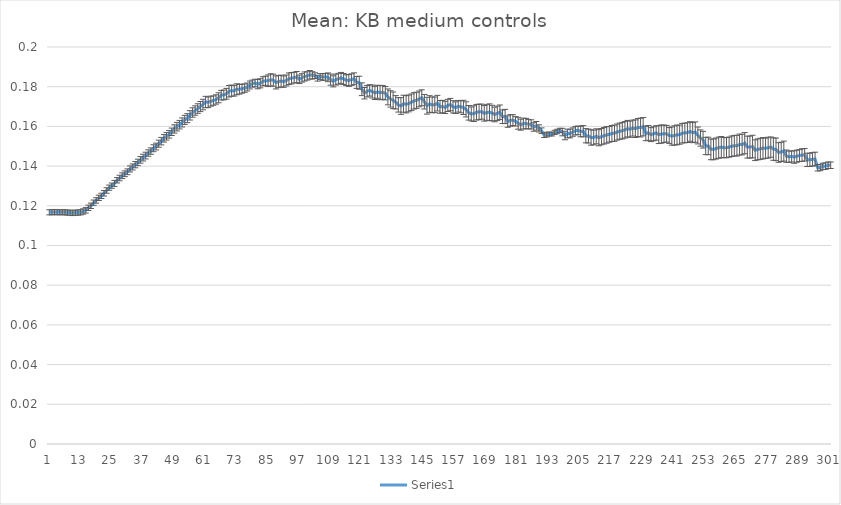
| Category | Series 0 |
|---|---|
| 0 | 0.117 |
| 1 | 0.117 |
| 2 | 0.117 |
| 3 | 0.117 |
| 4 | 0.117 |
| 5 | 0.117 |
| 6 | 0.117 |
| 7 | 0.117 |
| 8 | 0.117 |
| 9 | 0.116 |
| 10 | 0.117 |
| 11 | 0.117 |
| 12 | 0.117 |
| 13 | 0.117 |
| 14 | 0.118 |
| 15 | 0.119 |
| 16 | 0.12 |
| 17 | 0.122 |
| 18 | 0.123 |
| 19 | 0.124 |
| 20 | 0.125 |
| 21 | 0.126 |
| 22 | 0.128 |
| 23 | 0.129 |
| 24 | 0.13 |
| 25 | 0.131 |
| 26 | 0.133 |
| 27 | 0.134 |
| 28 | 0.135 |
| 29 | 0.136 |
| 30 | 0.137 |
| 31 | 0.139 |
| 32 | 0.14 |
| 33 | 0.141 |
| 34 | 0.142 |
| 35 | 0.143 |
| 36 | 0.144 |
| 37 | 0.145 |
| 38 | 0.147 |
| 39 | 0.148 |
| 40 | 0.149 |
| 41 | 0.15 |
| 42 | 0.151 |
| 43 | 0.153 |
| 44 | 0.154 |
| 45 | 0.155 |
| 46 | 0.156 |
| 47 | 0.157 |
| 48 | 0.159 |
| 49 | 0.16 |
| 50 | 0.161 |
| 51 | 0.162 |
| 52 | 0.163 |
| 53 | 0.164 |
| 54 | 0.166 |
| 55 | 0.167 |
| 56 | 0.168 |
| 57 | 0.169 |
| 58 | 0.17 |
| 59 | 0.171 |
| 60 | 0.172 |
| 61 | 0.172 |
| 62 | 0.173 |
| 63 | 0.173 |
| 64 | 0.174 |
| 65 | 0.174 |
| 66 | 0.176 |
| 67 | 0.176 |
| 68 | 0.176 |
| 69 | 0.178 |
| 70 | 0.178 |
| 71 | 0.178 |
| 72 | 0.179 |
| 73 | 0.179 |
| 74 | 0.179 |
| 75 | 0.179 |
| 76 | 0.18 |
| 77 | 0.181 |
| 78 | 0.182 |
| 79 | 0.182 |
| 80 | 0.181 |
| 81 | 0.182 |
| 82 | 0.183 |
| 83 | 0.183 |
| 84 | 0.183 |
| 85 | 0.183 |
| 86 | 0.183 |
| 87 | 0.182 |
| 88 | 0.183 |
| 89 | 0.183 |
| 90 | 0.183 |
| 91 | 0.183 |
| 92 | 0.184 |
| 93 | 0.184 |
| 94 | 0.185 |
| 95 | 0.185 |
| 96 | 0.184 |
| 97 | 0.184 |
| 98 | 0.185 |
| 99 | 0.185 |
| 100 | 0.186 |
| 101 | 0.186 |
| 102 | 0.186 |
| 103 | 0.184 |
| 104 | 0.185 |
| 105 | 0.185 |
| 106 | 0.185 |
| 107 | 0.185 |
| 108 | 0.184 |
| 109 | 0.183 |
| 110 | 0.184 |
| 111 | 0.184 |
| 112 | 0.184 |
| 113 | 0.184 |
| 114 | 0.183 |
| 115 | 0.183 |
| 116 | 0.184 |
| 117 | 0.184 |
| 118 | 0.182 |
| 119 | 0.182 |
| 120 | 0.179 |
| 121 | 0.177 |
| 122 | 0.178 |
| 123 | 0.178 |
| 124 | 0.178 |
| 125 | 0.177 |
| 126 | 0.177 |
| 127 | 0.177 |
| 128 | 0.177 |
| 129 | 0.177 |
| 130 | 0.175 |
| 131 | 0.174 |
| 132 | 0.173 |
| 133 | 0.172 |
| 134 | 0.171 |
| 135 | 0.17 |
| 136 | 0.171 |
| 137 | 0.171 |
| 138 | 0.172 |
| 139 | 0.172 |
| 140 | 0.173 |
| 141 | 0.173 |
| 142 | 0.174 |
| 143 | 0.174 |
| 144 | 0.172 |
| 145 | 0.17 |
| 146 | 0.171 |
| 147 | 0.171 |
| 148 | 0.171 |
| 149 | 0.172 |
| 150 | 0.17 |
| 151 | 0.17 |
| 152 | 0.17 |
| 153 | 0.171 |
| 154 | 0.171 |
| 155 | 0.17 |
| 156 | 0.169 |
| 157 | 0.17 |
| 158 | 0.17 |
| 159 | 0.17 |
| 160 | 0.169 |
| 161 | 0.167 |
| 162 | 0.166 |
| 163 | 0.166 |
| 164 | 0.167 |
| 165 | 0.167 |
| 166 | 0.167 |
| 167 | 0.167 |
| 168 | 0.167 |
| 169 | 0.167 |
| 170 | 0.167 |
| 171 | 0.166 |
| 172 | 0.167 |
| 173 | 0.167 |
| 174 | 0.165 |
| 175 | 0.165 |
| 176 | 0.162 |
| 177 | 0.163 |
| 178 | 0.163 |
| 179 | 0.163 |
| 180 | 0.162 |
| 181 | 0.161 |
| 182 | 0.161 |
| 183 | 0.161 |
| 184 | 0.161 |
| 185 | 0.161 |
| 186 | 0.16 |
| 187 | 0.16 |
| 188 | 0.159 |
| 189 | 0.158 |
| 190 | 0.156 |
| 191 | 0.156 |
| 192 | 0.156 |
| 193 | 0.156 |
| 194 | 0.157 |
| 195 | 0.157 |
| 196 | 0.158 |
| 197 | 0.157 |
| 198 | 0.155 |
| 199 | 0.156 |
| 200 | 0.156 |
| 201 | 0.157 |
| 202 | 0.158 |
| 203 | 0.158 |
| 204 | 0.157 |
| 205 | 0.158 |
| 206 | 0.155 |
| 207 | 0.155 |
| 208 | 0.154 |
| 209 | 0.154 |
| 210 | 0.155 |
| 211 | 0.154 |
| 212 | 0.155 |
| 213 | 0.155 |
| 214 | 0.156 |
| 215 | 0.156 |
| 216 | 0.156 |
| 217 | 0.157 |
| 218 | 0.157 |
| 219 | 0.158 |
| 220 | 0.158 |
| 221 | 0.158 |
| 222 | 0.159 |
| 223 | 0.159 |
| 224 | 0.159 |
| 225 | 0.159 |
| 226 | 0.159 |
| 227 | 0.159 |
| 228 | 0.16 |
| 229 | 0.156 |
| 230 | 0.157 |
| 231 | 0.156 |
| 232 | 0.156 |
| 233 | 0.157 |
| 234 | 0.156 |
| 235 | 0.156 |
| 236 | 0.156 |
| 237 | 0.156 |
| 238 | 0.155 |
| 239 | 0.155 |
| 240 | 0.155 |
| 241 | 0.156 |
| 242 | 0.156 |
| 243 | 0.157 |
| 244 | 0.157 |
| 245 | 0.157 |
| 246 | 0.157 |
| 247 | 0.157 |
| 248 | 0.157 |
| 249 | 0.155 |
| 250 | 0.154 |
| 251 | 0.153 |
| 252 | 0.15 |
| 253 | 0.15 |
| 254 | 0.148 |
| 255 | 0.148 |
| 256 | 0.149 |
| 257 | 0.149 |
| 258 | 0.15 |
| 259 | 0.149 |
| 260 | 0.149 |
| 261 | 0.15 |
| 262 | 0.15 |
| 263 | 0.15 |
| 264 | 0.15 |
| 265 | 0.151 |
| 266 | 0.151 |
| 267 | 0.152 |
| 268 | 0.15 |
| 269 | 0.15 |
| 270 | 0.15 |
| 271 | 0.148 |
| 272 | 0.148 |
| 273 | 0.149 |
| 274 | 0.149 |
| 275 | 0.149 |
| 276 | 0.149 |
| 277 | 0.15 |
| 278 | 0.149 |
| 279 | 0.148 |
| 280 | 0.147 |
| 281 | 0.147 |
| 282 | 0.148 |
| 283 | 0.145 |
| 284 | 0.145 |
| 285 | 0.145 |
| 286 | 0.145 |
| 287 | 0.145 |
| 288 | 0.145 |
| 289 | 0.146 |
| 290 | 0.146 |
| 291 | 0.143 |
| 292 | 0.143 |
| 293 | 0.143 |
| 294 | 0.144 |
| 295 | 0.139 |
| 296 | 0.139 |
| 297 | 0.14 |
| 298 | 0.14 |
| 299 | 0.14 |
| 300 | 0.14 |